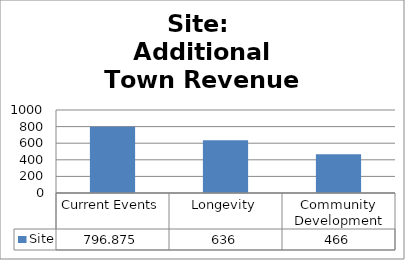
| Category | Site |
|---|---|
| Current Events | 796.875 |
| Longevity | 636 |
| Community Development | 466 |